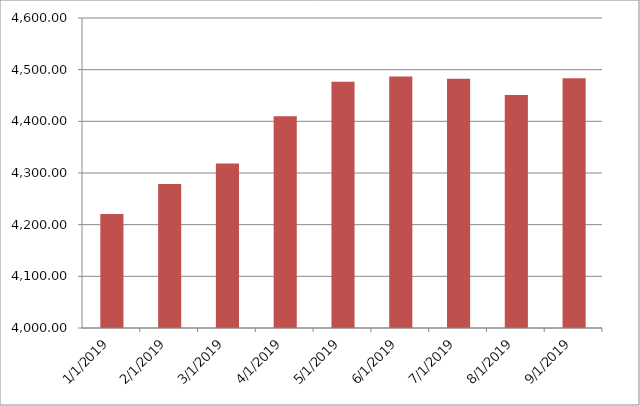
| Category | Series 0 | Series 1 |
|---|---|---|
| 1/1/19 |  | 4220.44 |
| 2/1/19 |  | 4278.86 |
| 3/1/19 |  | 4318.42 |
| 4/1/19 |  | 4410.04 |
| 5/1/19 |  | 4476.6 |
| 6/1/19 |  | 4486.97 |
| 7/1/19 |  | 4482.57 |
| 8/1/19 |  | 4450.86 |
| 9/1/19 |  | 4483.52 |